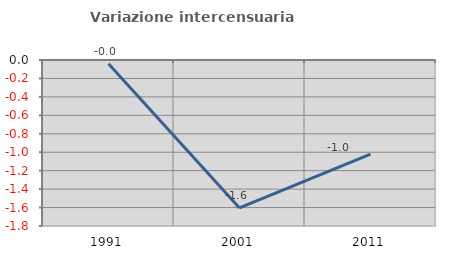
| Category | Variazione intercensuaria annua |
|---|---|
| 1991.0 | -0.04 |
| 2001.0 | -1.604 |
| 2011.0 | -1.02 |